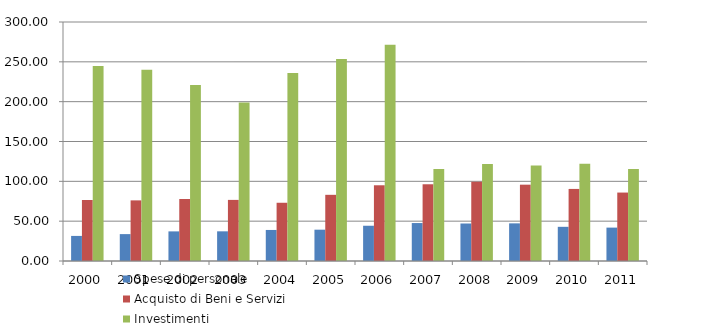
| Category | Spese di personale | Acquisto di Beni e Servizi | Investimenti |
|---|---|---|---|
| 2000 | 31.482 | 76.59 | 244.793 |
| 2001 | 33.75 | 76.095 | 239.952 |
| 2002 | 37.178 | 77.81 | 220.904 |
| 2003 | 37.246 | 76.7 | 199.09 |
| 2004 | 38.96 | 73.101 | 236.009 |
| 2005 | 39.309 | 83.068 | 253.598 |
| 2006 | 44.252 | 95.053 | 271.443 |
| 2007 | 47.636 | 96.315 | 115.542 |
| 2008 | 47.073 | 99.481 | 121.64 |
| 2009 | 47.246 | 95.808 | 119.979 |
| 2010 | 42.9 | 90.471 | 122.103 |
| 2011 | 41.914 | 85.91 | 115.376 |